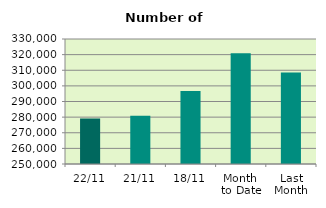
| Category | Series 0 |
|---|---|
| 22/11 | 279084 |
| 21/11 | 280806 |
| 18/11 | 296660 |
| Month 
to Date | 320917.875 |
| Last
Month | 308508.19 |